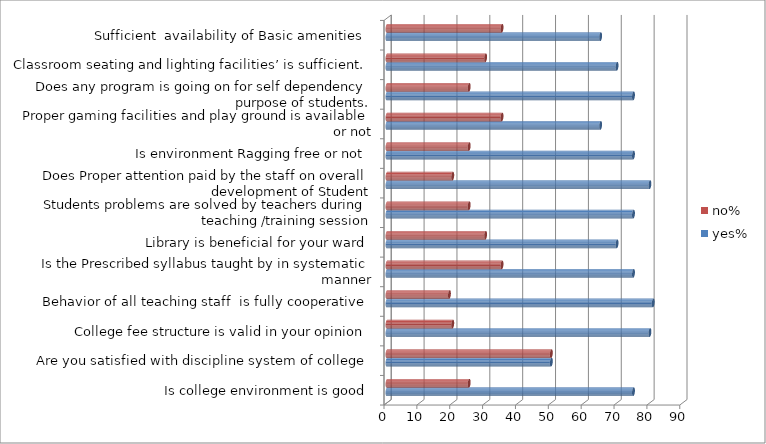
| Category | yes% | no% |
|---|---|---|
| Is college environment is good | 75 | 25 |
| Are you satisfied with discipline system of college | 50 | 50 |
| College fee structure is valid in your opinion | 80 | 20 |
| Behavior of all teaching staff  is fully cooperative | 81 | 19 |
| Is the Prescribed syllabus taught by in systematic manner | 75 | 35 |
| Library is beneficial for your ward | 70 | 30 |
| Students problems are solved by teachers during teaching /training session | 75 | 25 |
| Does Proper attention paid by the staff on overall development of Student | 80 | 20 |
| Is environment Ragging free or not | 75 | 25 |
| Proper gaming facilities and play ground is available or not | 65 | 35 |
| Does any program is going on for self dependency purpose of students. | 75 | 25 |
| Classroom seating and lighting facilities’ is sufficient. | 70 | 30 |
| Sufficient  availability of Basic amenities  | 65 | 35 |